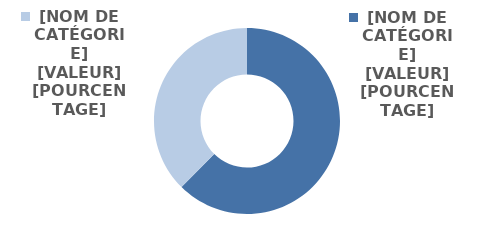
| Category | Series 0 |
|---|---|
| Etudiantes | 11778 |
| Etudiants | 7087 |